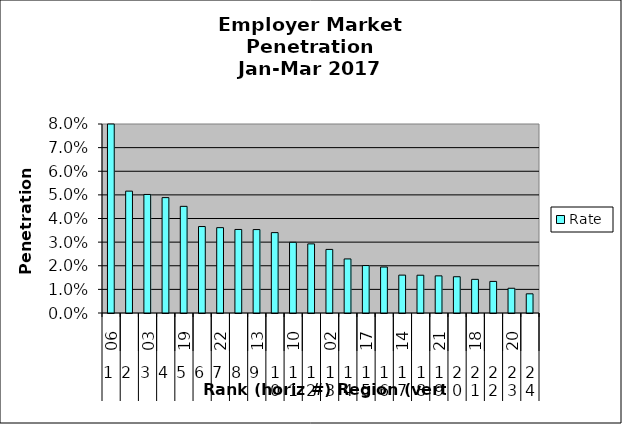
| Category | Rate |
|---|---|
| 0 | 0.087 |
| 1 | 0.052 |
| 2 | 0.05 |
| 3 | 0.049 |
| 4 | 0.045 |
| 5 | 0.037 |
| 6 | 0.036 |
| 7 | 0.035 |
| 8 | 0.035 |
| 9 | 0.034 |
| 10 | 0.03 |
| 11 | 0.029 |
| 12 | 0.027 |
| 13 | 0.023 |
| 14 | 0.02 |
| 15 | 0.019 |
| 16 | 0.016 |
| 17 | 0.016 |
| 18 | 0.016 |
| 19 | 0.015 |
| 20 | 0.014 |
| 21 | 0.013 |
| 22 | 0.01 |
| 23 | 0.008 |